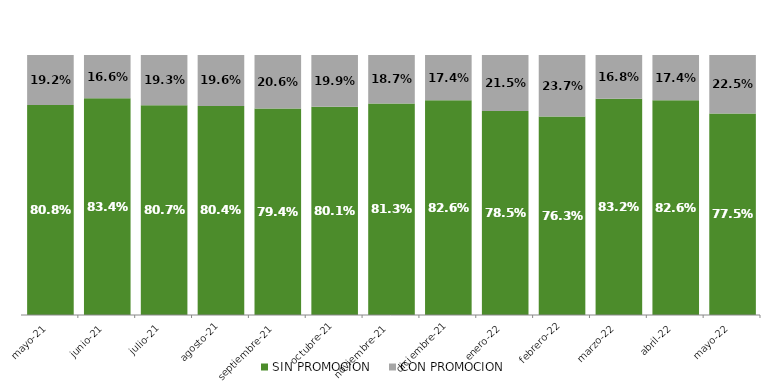
| Category | SIN PROMOCION   | CON PROMOCION   |
|---|---|---|
| 2021-05-01 | 0.808 | 0.192 |
| 2021-06-01 | 0.834 | 0.166 |
| 2021-07-01 | 0.807 | 0.193 |
| 2021-08-01 | 0.804 | 0.196 |
| 2021-09-01 | 0.794 | 0.206 |
| 2021-10-01 | 0.801 | 0.199 |
| 2021-11-01 | 0.813 | 0.187 |
| 2021-12-01 | 0.826 | 0.174 |
| 2022-01-01 | 0.785 | 0.215 |
| 2022-02-01 | 0.763 | 0.237 |
| 2022-03-01 | 0.832 | 0.168 |
| 2022-04-01 | 0.826 | 0.174 |
| 2022-05-01 | 0.775 | 0.225 |